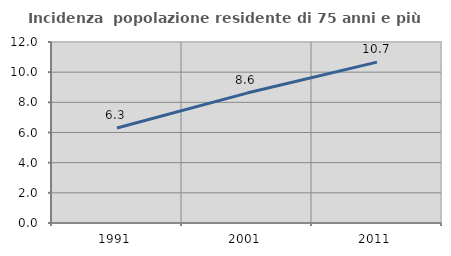
| Category | Incidenza  popolazione residente di 75 anni e più |
|---|---|
| 1991.0 | 6.296 |
| 2001.0 | 8.614 |
| 2011.0 | 10.668 |